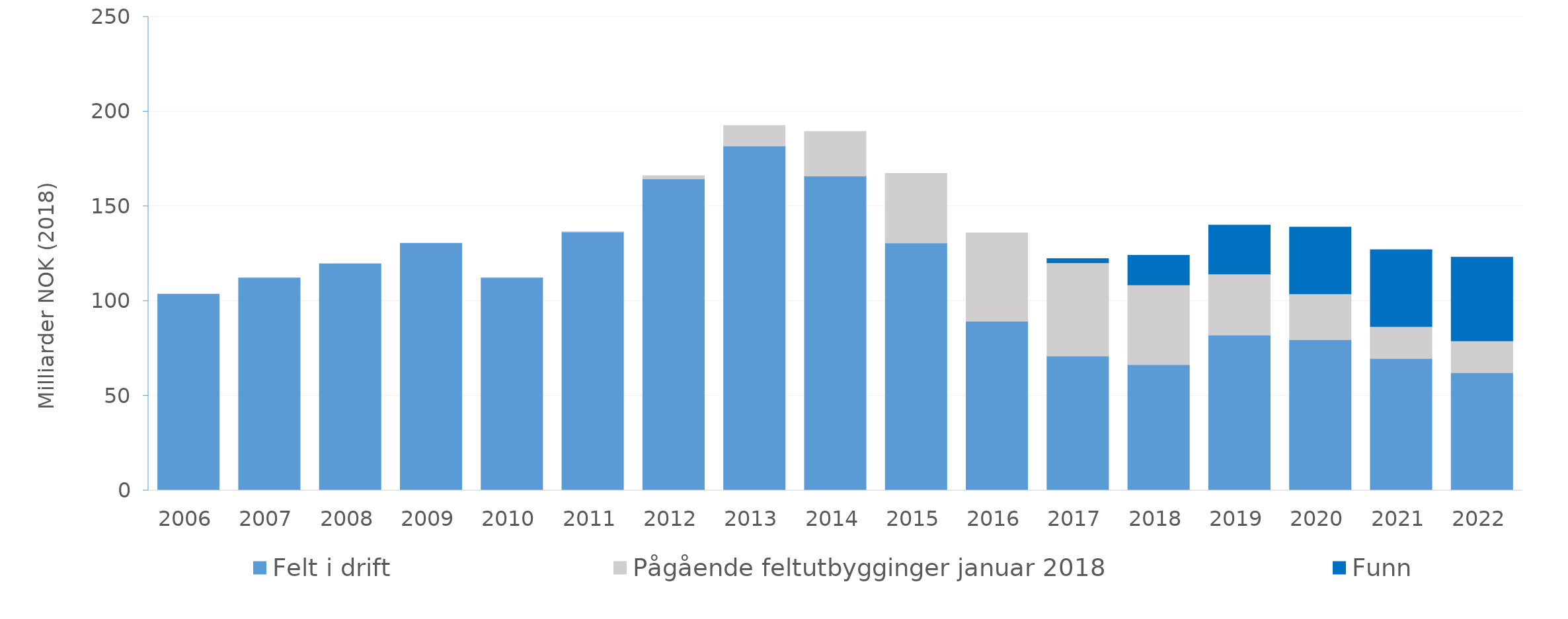
| Category | Felt i drift | Pågående feltutbygginger januar 2018 | Funn |
|---|---|---|---|
| 2006.0 | 103.686 | 0 | 0 |
| 2007.0 | 112.216 | 0 | 0 |
| 2008.0 | 119.715 | 0 | 0 |
| 2009.0 | 130.506 | 0 | 0 |
| 2010.0 | 112.198 | 0 | 0 |
| 2011.0 | 136.392 | 0.236 | 0 |
| 2012.0 | 164.445 | 1.665 | 0 |
| 2013.0 | 181.815 | 10.851 | 0 |
| 2014.0 | 165.976 | 23.507 | 0 |
| 2015.0 | 130.657 | 36.725 | 0 |
| 2016.0 | 89.327 | 46.663 | 0 |
| 2017.0 | 70.998 | 49.21 | 2.184 |
| 2018.0 | 66.45 | 42.103 | 15.58 |
| 2019.0 | 81.989 | 32.328 | 25.751 |
| 2020.0 | 79.615 | 24.208 | 35.254 |
| 2021.0 | 69.634 | 16.889 | 40.533 |
| 2022.0 | 62.172 | 16.821 | 44.166 |